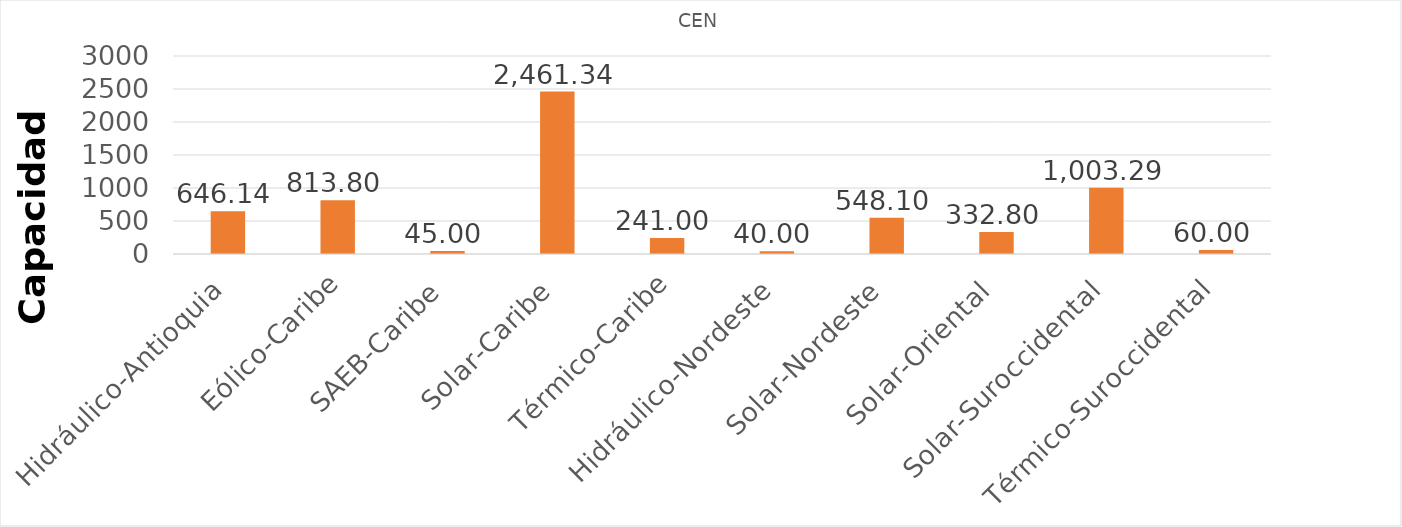
| Category | CEN |
|---|---|
| Hidráulico-Antioquia | 646.14 |
| Eólico-Caribe | 813.8 |
| SAEB-Caribe | 45 |
| Solar-Caribe | 2461.34 |
| Térmico-Caribe | 241 |
| Hidráulico-Nordeste | 40 |
| Solar-Nordeste | 548.1 |
| Solar-Oriental | 332.8 |
| Solar-Suroccidental | 1003.29 |
| Térmico-Suroccidental | 60 |